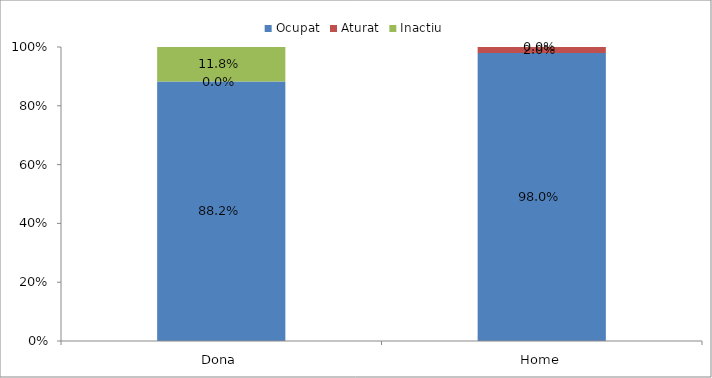
| Category | Ocupat | Aturat | Inactiu |
|---|---|---|---|
| Dona | 0.882 | 0 | 0.118 |
| Home | 0.98 | 0.02 | 0 |